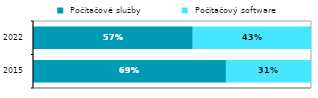
| Category |  Počítačové služby |  Počítačový software |
|---|---|---|
|  2015 | 0.694 | 0.306 |
| 2022 | 0.575 | 0.425 |